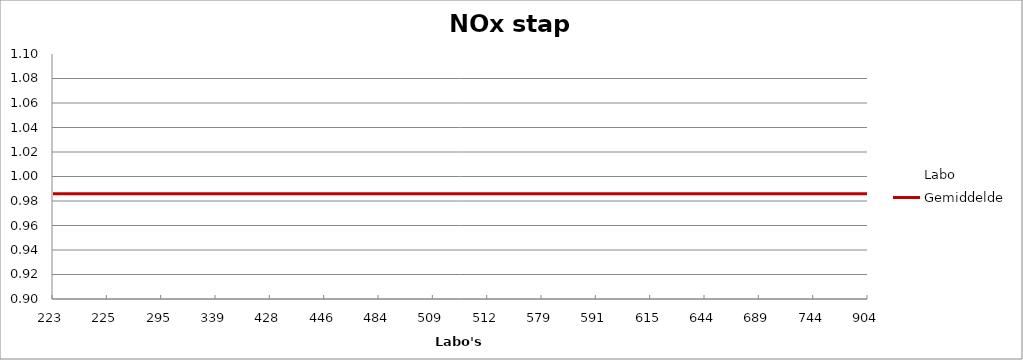
| Category | Labo | Gemiddelde |
|---|---|---|
| 223.0 | 1.075 | 0.986 |
| 225.0 | 0.946 | 0.986 |
| 295.0 | 1.075 | 0.986 |
| 339.0 | 0.902 | 0.986 |
| 428.0 | 1.014 | 0.986 |
| 446.0 | 0.972 | 0.986 |
| 484.0 | 0.975 | 0.986 |
| 509.0 | 0.981 | 0.986 |
| 512.0 | 0.991 | 0.986 |
| 579.0 | 0.999 | 0.986 |
| 591.0 | 0.986 | 0.986 |
| 615.0 | 0.951 | 0.986 |
| 644.0 | 1.067 | 0.986 |
| 689.0 | 0.93 | 0.986 |
| 744.0 | 0.98 | 0.986 |
| 904.0 | 0.941 | 0.986 |